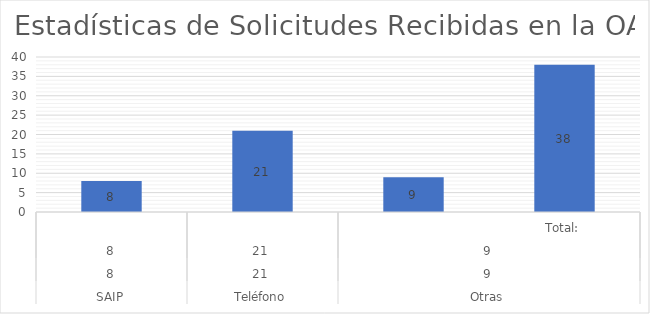
| Category | Series 0 |
|---|---|
| 0 | 8 |
| 1 | 21 |
| 2 | 9 |
| 3 | 38 |